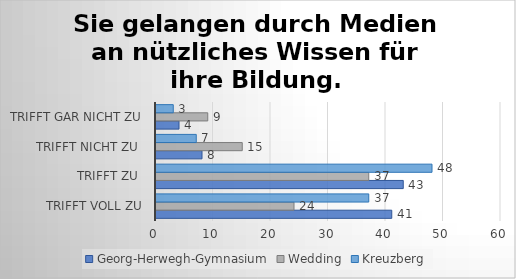
| Category | Georg-Herwegh-Gymnasium | Wedding | Kreuzberg |
|---|---|---|---|
| trifft voll zu | 41 | 24 | 37 |
| trifft zu  | 43 | 37 | 48 |
| trifft nicht zu  | 8 | 15 | 7 |
| trifft gar nicht zu | 4 | 9 | 3 |